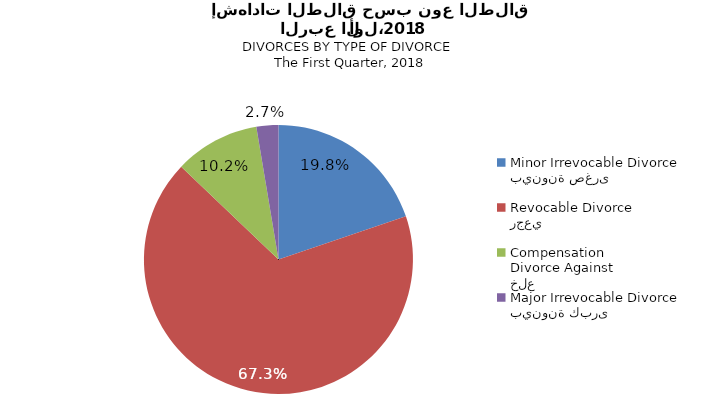
| Category | Series 1 |
|---|---|
| بينونة صغرى
Minor Irrevocable Divorce  | 19.802 |
| رجعي
Revocable Divorce  | 67.327 |
| خلع
Divorce Against Compensation | 10.231 |
| بينونة كبرى
Major Irrevocable Divorce  | 2.64 |